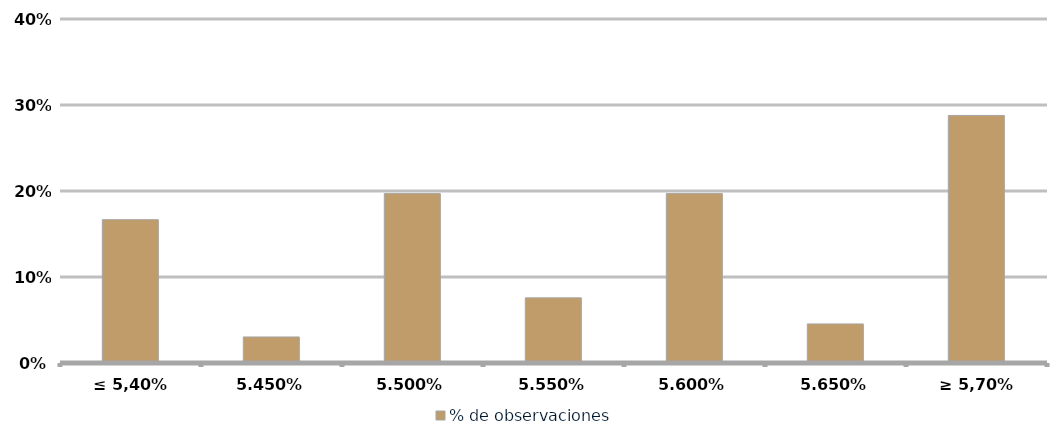
| Category | % de observaciones  |
|---|---|
| ≤ 5,40% | 0.167 |
| 5,45% | 0.03 |
| 5,50% | 0.197 |
| 5,55% | 0.076 |
| 5,60% | 0.197 |
| 5,65% | 0.045 |
| ≥ 5,70% | 0.288 |